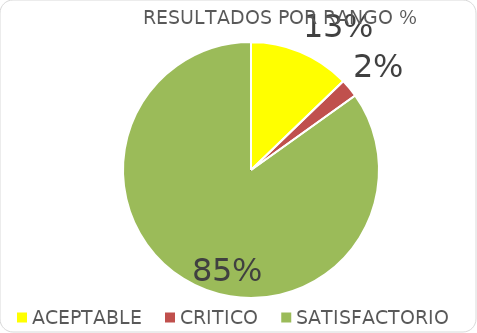
| Category | Total |
|---|---|
| ACEPTABLE | 0.128 |
| CRITICO | 0.023 |
| SATISFACTORIO | 0.849 |